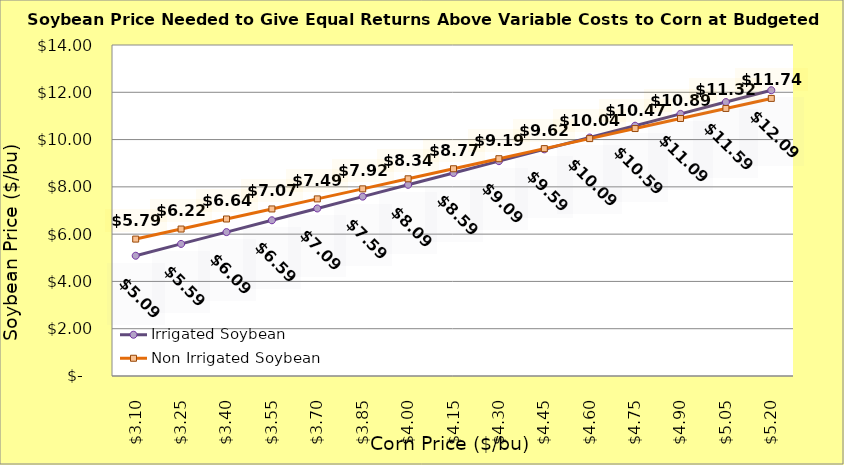
| Category | Irrigated Soybean | Non Irrigated Soybean |
|---|---|---|
| 3.1000000000000005 | 5.086 | 5.791 |
| 3.2500000000000004 | 5.586 | 6.216 |
| 3.4000000000000004 | 6.086 | 6.641 |
| 3.5500000000000003 | 6.586 | 7.066 |
| 3.7 | 7.086 | 7.491 |
| 3.85 | 7.586 | 7.916 |
| 4.0 | 8.086 | 8.341 |
| 4.15 | 8.586 | 8.766 |
| 4.300000000000001 | 9.086 | 9.191 |
| 4.450000000000001 | 9.586 | 9.616 |
| 4.600000000000001 | 10.086 | 10.041 |
| 4.750000000000002 | 10.586 | 10.466 |
| 4.900000000000002 | 11.086 | 10.891 |
| 5.0500000000000025 | 11.586 | 11.316 |
| 5.200000000000003 | 12.086 | 11.741 |